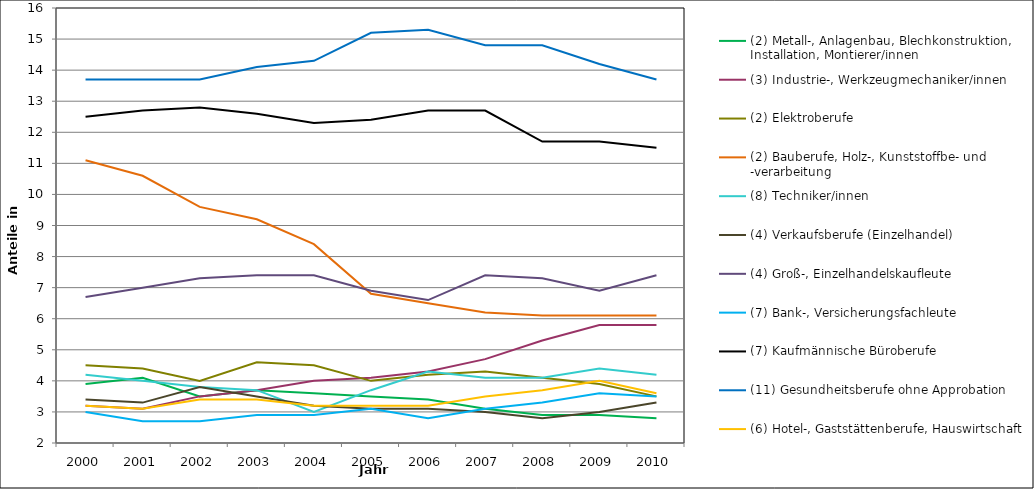
| Category | (2) Metall-, Anlagenbau, Blechkonstruktion, Installation, Montierer/innen | (3) Industrie-, Werkzeugmechaniker/innen | (2) Elektroberufe | (2) Bauberufe, Holz-, Kunststoffbe- und -verarbeitung | (8) Techniker/innen | (4) Verkaufsberufe (Einzelhandel) | (4) Groß-, Einzelhandelskaufleute | (7) Bank-, Versicherungsfachleute | (7) Kaufmännische Büroberufe | (11) Gesundheitsberufe ohne Approbation | (6) Hotel-, Gaststättenberufe, Hauswirtschaft |
|---|---|---|---|---|---|---|---|---|---|---|---|
| 2000.0 | 3.9 | 3.2 | 4.5 | 11.1 | 4.2 | 3.4 | 6.7 | 3 | 12.5 | 13.7 | 3.2 |
| 2001.0 | 4.1 | 3.1 | 4.4 | 10.6 | 4 | 3.3 | 7 | 2.7 | 12.7 | 13.7 | 3.1 |
| 2002.0 | 3.5 | 3.5 | 4 | 9.6 | 3.8 | 3.8 | 7.3 | 2.7 | 12.8 | 13.7 | 3.4 |
| 2003.0 | 3.7 | 3.7 | 4.6 | 9.2 | 3.7 | 3.5 | 7.4 | 2.9 | 12.6 | 14.1 | 3.4 |
| 2004.0 | 3.6 | 4 | 4.5 | 8.4 | 3 | 3.2 | 7.4 | 2.9 | 12.3 | 14.3 | 3.2 |
| 2005.0 | 3.5 | 4.1 | 4 | 6.8 | 3.7 | 3.1 | 6.9 | 3.1 | 12.4 | 15.2 | 3.2 |
| 2006.0 | 3.4 | 4.3 | 4.2 | 6.5 | 4.3 | 3.1 | 6.6 | 2.8 | 12.7 | 15.3 | 3.2 |
| 2007.0 | 3.1 | 4.7 | 4.3 | 6.2 | 4.1 | 3 | 7.4 | 3.1 | 12.7 | 14.8 | 3.5 |
| 2008.0 | 2.9 | 5.3 | 4.1 | 6.1 | 4.1 | 2.8 | 7.3 | 3.3 | 11.7 | 14.8 | 3.7 |
| 2009.0 | 2.9 | 5.8 | 3.9 | 6.1 | 4.4 | 3 | 6.9 | 3.6 | 11.7 | 14.2 | 4 |
| 2010.0 | 2.8 | 5.8 | 3.5 | 6.1 | 4.2 | 3.3 | 7.4 | 3.5 | 11.5 | 13.7 | 3.6 |